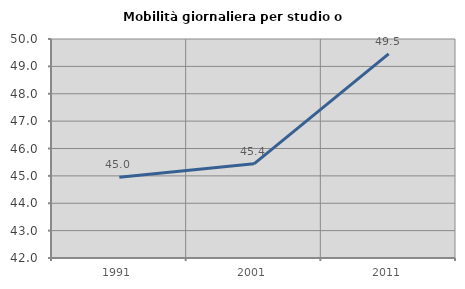
| Category | Mobilità giornaliera per studio o lavoro |
|---|---|
| 1991.0 | 44.951 |
| 2001.0 | 45.441 |
| 2011.0 | 49.457 |